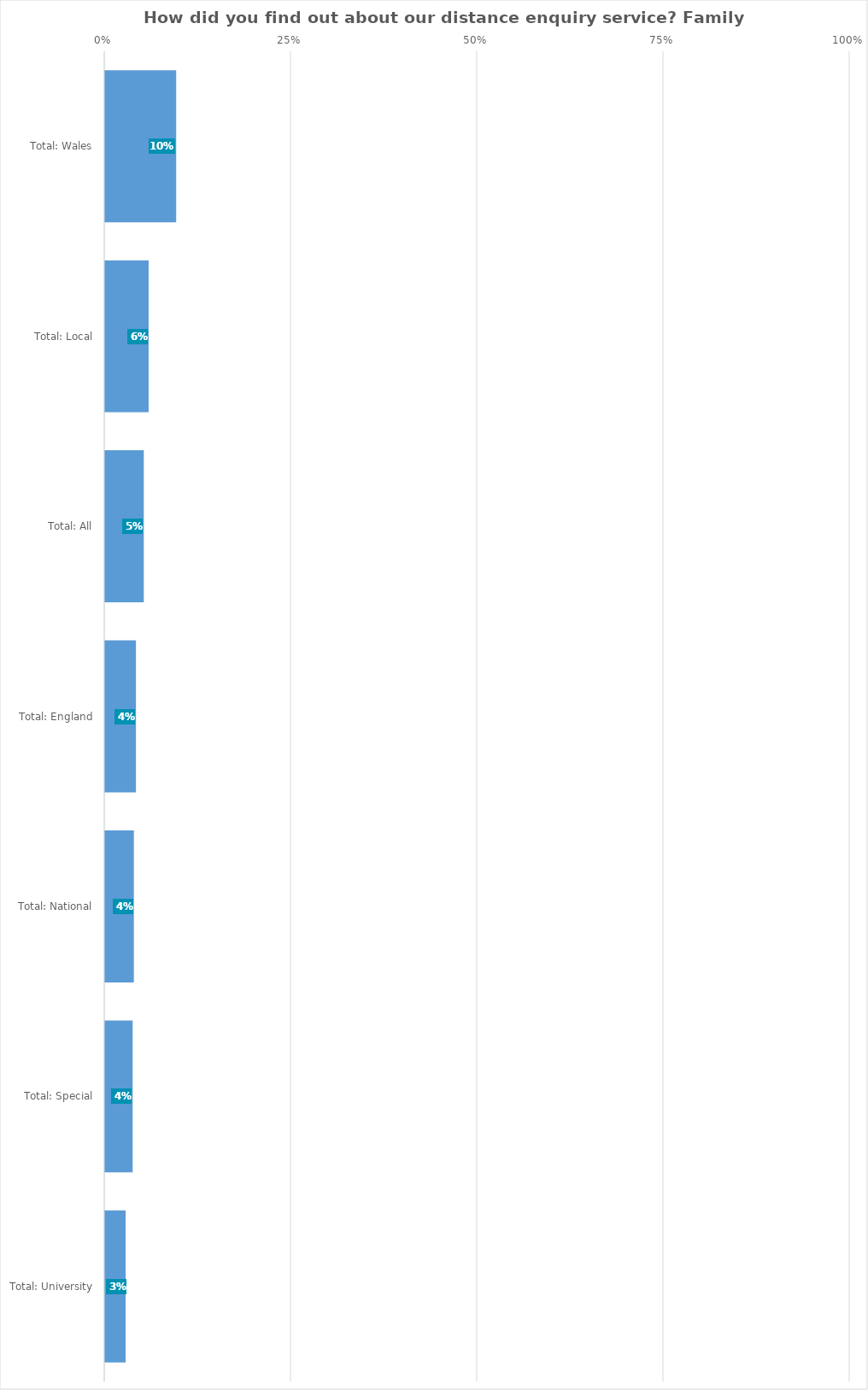
| Category | Family History Society |
|---|---|
| Total: Wales | 0.095 |
| Total: Local | 0.058 |
| Total: All | 0.052 |
| Total: England | 0.041 |
| Total: National | 0.039 |
| Total: Special | 0.037 |
| Total: University | 0.028 |